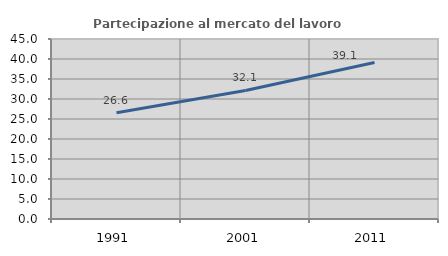
| Category | Partecipazione al mercato del lavoro  femminile |
|---|---|
| 1991.0 | 26.568 |
| 2001.0 | 32.143 |
| 2011.0 | 39.106 |